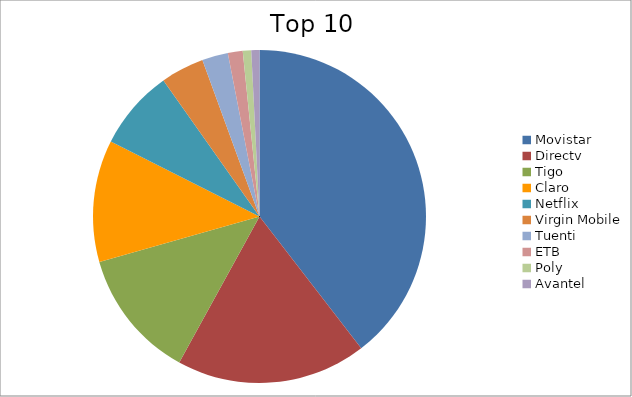
| Category | Series 0 |
|---|---|
| Movistar | 39.54 |
| Directv | 18.46 |
| Tigo | 12.58 |
| Claro | 11.84 |
| Netflix | 7.78 |
| Virgin Mobile | 4.22 |
| Tuenti | 2.52 |
| ETB | 1.44 |
| Poly | 0.82 |
| Avantel | 0.79 |